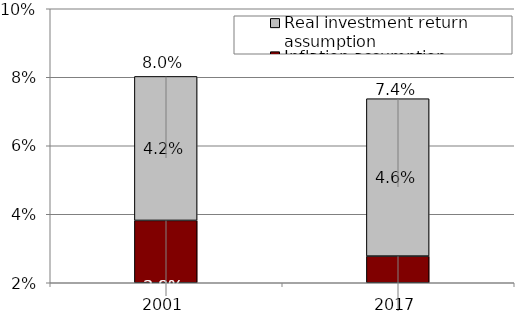
| Category | Inflation assumption | Real investment return assumption |
|---|---|---|
| 0 | 0.038 | 0.042 |
| 1 | 0.028 | 0.046 |